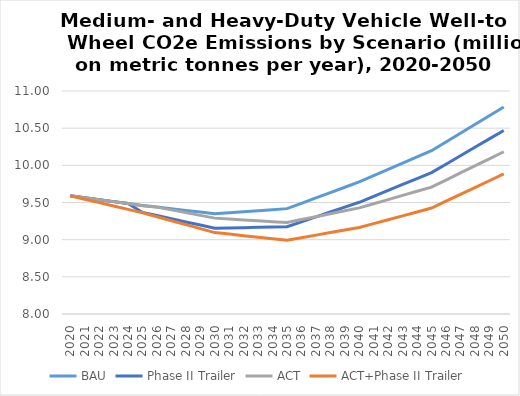
| Category | BAU | Phase II Trailer | ACT | ACT+Phase II Trailer |
|---|---|---|---|---|
| 2020.0 | 9.59 | 9.59 | 9.59 | 9.59 |
| 2021.0 | 9.564 | 9.564 | 9.564 | 9.544 |
| 2022.0 | 9.538 | 9.538 | 9.538 | 9.498 |
| 2023.0 | 9.512 | 9.512 | 9.512 | 9.453 |
| 2024.0 | 9.486 | 9.486 | 9.486 | 9.407 |
| 2025.0 | 9.46 | 9.367 | 9.455 | 9.361 |
| 2026.0 | 9.438 | 9.324 | 9.438 | 9.308 |
| 2027.0 | 9.416 | 9.281 | 9.401 | 9.255 |
| 2028.0 | 9.394 | 9.239 | 9.364 | 9.202 |
| 2029.0 | 9.371 | 9.196 | 9.327 | 9.148 |
| 2030.0 | 9.349 | 9.153 | 9.29 | 9.095 |
| 2031.0 | 9.363 | 9.158 | 9.278 | 9.075 |
| 2032.0 | 9.376 | 9.162 | 9.266 | 9.054 |
| 2033.0 | 9.39 | 9.166 | 9.254 | 9.034 |
| 2034.0 | 9.404 | 9.17 | 9.243 | 9.013 |
| 2035.0 | 9.417 | 9.175 | 9.231 | 8.993 |
| 2036.0 | 9.489 | 9.24 | 9.27 | 9.027 |
| 2037.0 | 9.561 | 9.306 | 9.31 | 9.061 |
| 2038.0 | 9.633 | 9.372 | 9.349 | 9.095 |
| 2039.0 | 9.705 | 9.437 | 9.388 | 9.129 |
| 2040.0 | 9.777 | 9.503 | 9.428 | 9.163 |
| 2041.0 | 9.861 | 9.583 | 9.483 | 9.216 |
| 2042.0 | 9.945 | 9.663 | 9.539 | 9.268 |
| 2043.0 | 10.029 | 9.742 | 9.595 | 9.321 |
| 2044.0 | 10.113 | 9.822 | 9.651 | 9.373 |
| 2045.0 | 10.197 | 9.902 | 9.707 | 9.426 |
| 2046.0 | 10.315 | 10.015 | 9.802 | 9.517 |
| 2047.0 | 10.432 | 10.129 | 9.897 | 9.609 |
| 2048.0 | 10.55 | 10.242 | 9.993 | 9.701 |
| 2049.0 | 10.667 | 10.356 | 10.088 | 9.792 |
| 2050.0 | 10.785 | 10.469 | 10.183 | 9.884 |